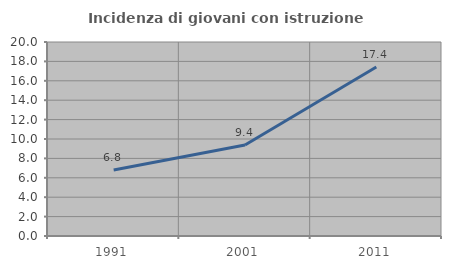
| Category | Incidenza di giovani con istruzione universitaria |
|---|---|
| 1991.0 | 6.805 |
| 2001.0 | 9.375 |
| 2011.0 | 17.424 |